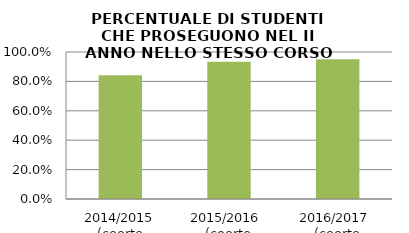
| Category | 2014/2015 (coorte 2013/14) 2015/2016  (coorte 2014/15) 2016/2017  (coorte 2015/16) |
|---|---|
| 2014/2015 (coorte 2013/14) | 0.842 |
| 2015/2016  (coorte 2014/15) | 0.933 |
| 2016/2017  (coorte 2015/16) | 0.95 |